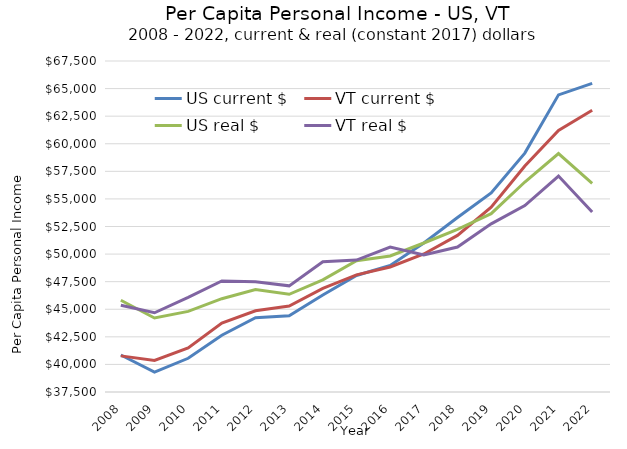
| Category | US current $ | VT current $ | US real $ | VT real $ |
|---|---|---|---|---|
| 2022 | 65470 | 63039 | 56419 | 53806 |
| 2021 | 64430 | 61214 | 59110 | 57077 |
| 2020 | 59153 | 57978 | 56533 | 54402 |
| 2019 | 55547 | 54257 | 53662 | 52739 |
| 2018 | 53309 | 51692 | 52240 | 50638 |
| 2017 | 51004 | 50011 | 51004 | 49930 |
| 2016 | 48971 | 48831 | 49826 | 50635 |
| 2015 | 48060 | 48120 | 49394 | 49460 |
| 2014 | 46287 | 46897 | 47659 | 49298 |
| 2013 | 44401 | 45298 | 46357 | 47120 |
| 2012 | 44237 | 44861 | 46795 | 47494 |
| 2011 | 42649 | 43756 | 45956 | 47570 |
| 2010 | 40557 | 41492 | 44808 | 46082 |
| 2009 | 39307 | 40358 | 44204 | 44683 |
| 2008 | 40854 | 40774 | 45816 | 45363 |